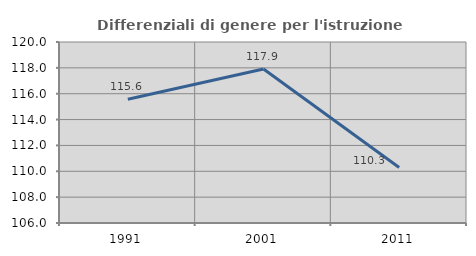
| Category | Differenziali di genere per l'istruzione superiore |
|---|---|
| 1991.0 | 115.57 |
| 2001.0 | 117.911 |
| 2011.0 | 110.298 |